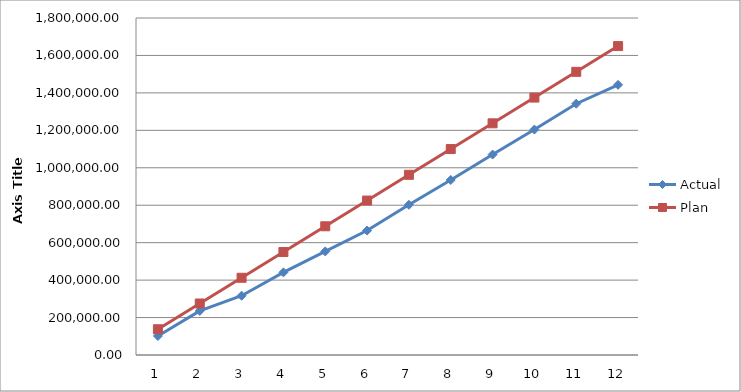
| Category | Actual | Plan |
|---|---|---|
| 0 | 101608.1 | 137500 |
| 1 | 235355.24 | 275000 |
| 2 | 316598.41 | 412500 |
| 3 | 441403.98 | 550000 |
| 4 | 553188.51 | 687500 |
| 5 | 664834.59 | 825000 |
| 6 | 802180.89 | 962500 |
| 7 | 934730.43 | 1100000 |
| 8 | 1070512.6 | 1237500 |
| 9 | 1204077.8 | 1375000 |
| 10 | 1342174.93 | 1512500 |
| 11 | 1442959.07 | 1650000 |